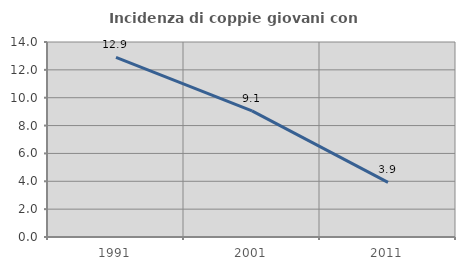
| Category | Incidenza di coppie giovani con figli |
|---|---|
| 1991.0 | 12.892 |
| 2001.0 | 9.053 |
| 2011.0 | 3.922 |